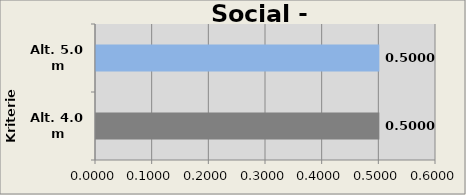
| Category | Social - C |
|---|---|
| Alt. 4.0 m | 0.5 |
| Alt. 5.0 m | 0.5 |